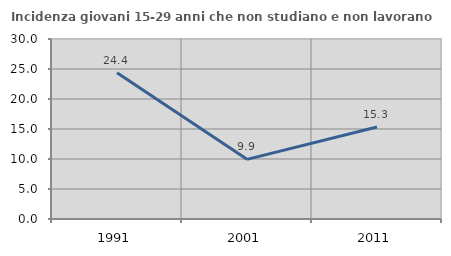
| Category | Incidenza giovani 15-29 anni che non studiano e non lavorano  |
|---|---|
| 1991.0 | 24.37 |
| 2001.0 | 9.944 |
| 2011.0 | 15.328 |